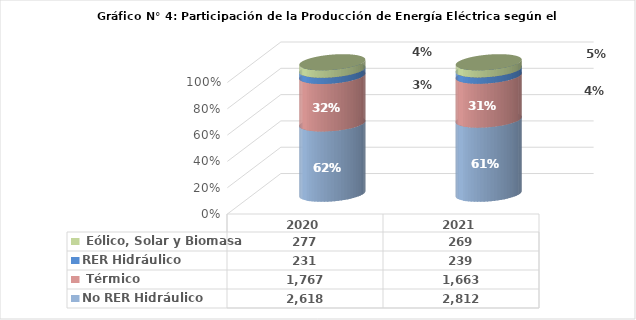
| Category | No RER | RER |
|---|---|---|
| 2020.0 | 1767.139 | 276.786 |
| 2021.0 | 1663.376 | 269.496 |